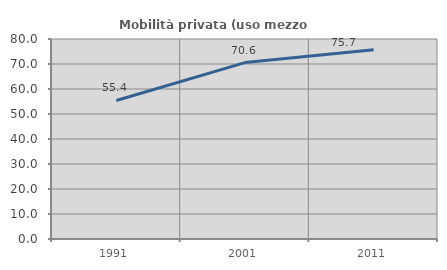
| Category | Mobilità privata (uso mezzo privato) |
|---|---|
| 1991.0 | 55.411 |
| 2001.0 | 70.564 |
| 2011.0 | 75.676 |